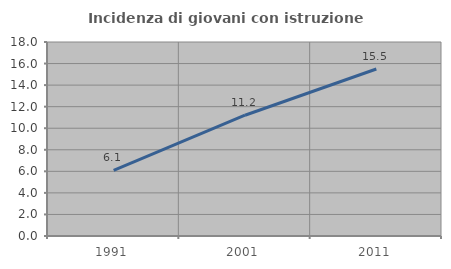
| Category | Incidenza di giovani con istruzione universitaria |
|---|---|
| 1991.0 | 6.081 |
| 2001.0 | 11.207 |
| 2011.0 | 15.493 |